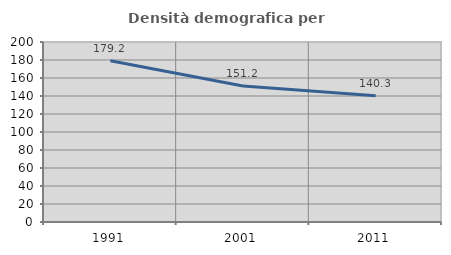
| Category | Densità demografica |
|---|---|
| 1991.0 | 179.207 |
| 2001.0 | 151.156 |
| 2011.0 | 140.252 |